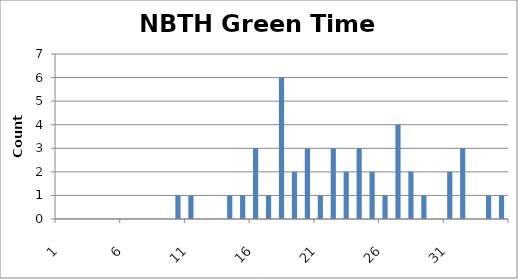
| Category | Series 0 |
|---|---|
| 0 | 0 |
| 1 | 0 |
| 2 | 0 |
| 3 | 0 |
| 4 | 0 |
| 5 | 0 |
| 6 | 0 |
| 7 | 0 |
| 8 | 0 |
| 9 | 1 |
| 10 | 1 |
| 11 | 0 |
| 12 | 0 |
| 13 | 1 |
| 14 | 1 |
| 15 | 3 |
| 16 | 1 |
| 17 | 6 |
| 18 | 2 |
| 19 | 3 |
| 20 | 1 |
| 21 | 3 |
| 22 | 2 |
| 23 | 3 |
| 24 | 2 |
| 25 | 1 |
| 26 | 4 |
| 27 | 2 |
| 28 | 1 |
| 29 | 0 |
| 30 | 2 |
| 31 | 3 |
| 32 | 0 |
| 33 | 1 |
| 34 | 1 |